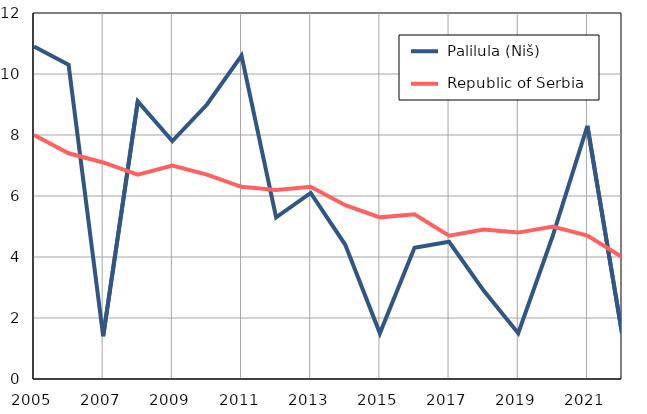
| Category |  Palilula (Niš) |  Republic of Serbia |
|---|---|---|
| 2005.0 | 10.9 | 8 |
| 2006.0 | 10.3 | 7.4 |
| 2007.0 | 1.4 | 7.1 |
| 2008.0 | 9.1 | 6.7 |
| 2009.0 | 7.8 | 7 |
| 2010.0 | 9 | 6.7 |
| 2011.0 | 10.6 | 6.3 |
| 2012.0 | 5.3 | 6.2 |
| 2013.0 | 6.1 | 6.3 |
| 2014.0 | 4.4 | 5.7 |
| 2015.0 | 1.5 | 5.3 |
| 2016.0 | 4.3 | 5.4 |
| 2017.0 | 4.5 | 4.7 |
| 2018.0 | 2.9 | 4.9 |
| 2019.0 | 1.5 | 4.8 |
| 2020.0 | 4.7 | 5 |
| 2021.0 | 8.3 | 4.7 |
| 2022.0 | 1.5 | 4 |